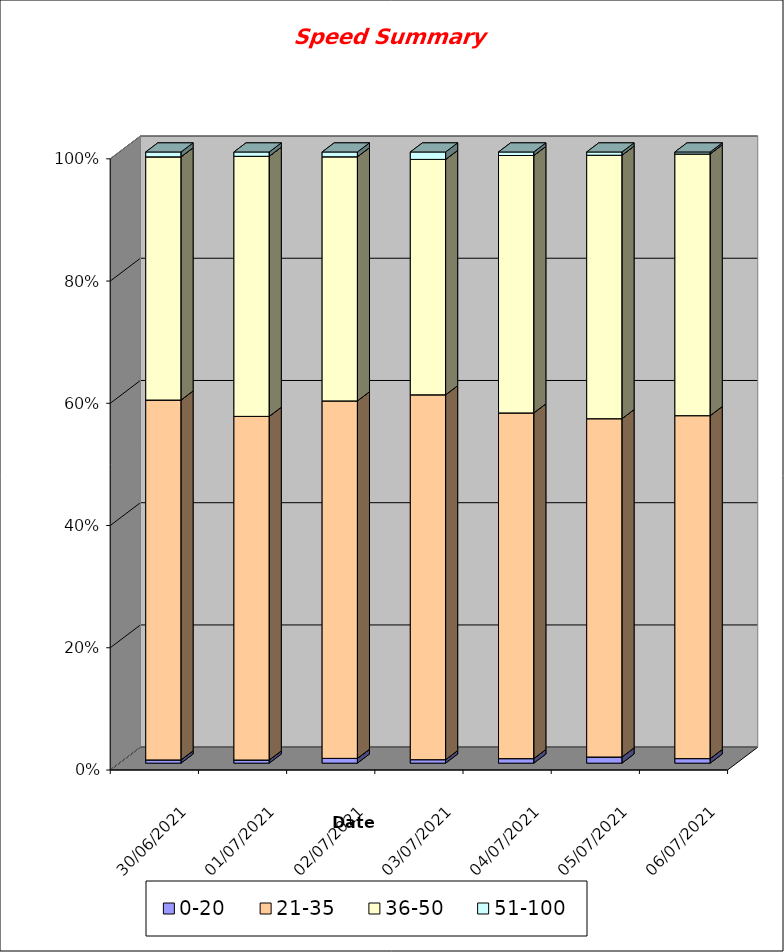
| Category | 0-20 | 21-35 | 36-50 | 51-100 |
|---|---|---|---|---|
| 30/06/2021 | 12 | 1329 | 898 | 18 |
| 01/07/2021 | 11 | 1197 | 906 | 15 |
| 02/07/2021 | 16 | 1192 | 814 | 16 |
| 03/07/2021 | 8 | 834 | 538 | 17 |
| 04/07/2021 | 9 | 685 | 510 | 7 |
| 05/07/2021 | 19 | 1044 | 813 | 10 |
| 06/07/2021 | 14 | 1051 | 802 | 6 |